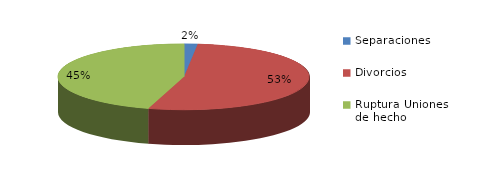
| Category | Series 0 |
|---|---|
| Separaciones | 12 |
| Divorcios | 367 |
| Ruptura Uniones de hecho | 316 |